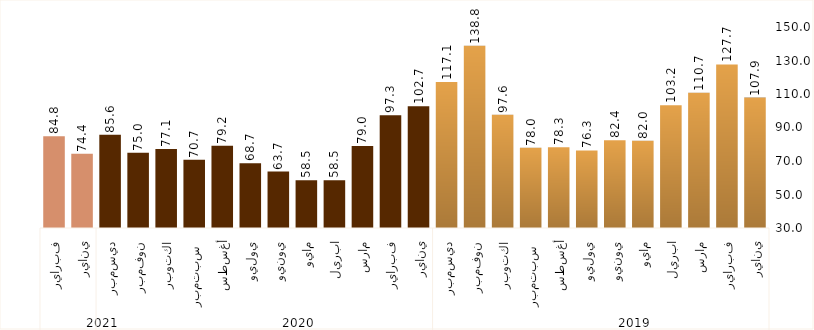
| Category | Series 0 |
|---|---|
| 0 | 107.861 |
| 1 | 127.674 |
| 2 | 110.742 |
| 3 | 103.239 |
| 4 | 82.016 |
| 5 | 82.421 |
| 6 | 76.314 |
| 7 | 78.265 |
| 8 | 77.961 |
| 9 | 97.566 |
| 10 | 138.85 |
| 11 | 117.091 |
| 12 | 102.678 |
| 13 | 97.332 |
| 14 | 78.955 |
| 15 | 58.549 |
| 16 | 58.455 |
| 17 | 63.691 |
| 18 | 68.721 |
| 19 | 79.161 |
| 20 | 70.692 |
| 21 | 77.111 |
| 22 | 74.955 |
| 23 | 85.627 |
| 24 | 74.378 |
| 25 | 84.831 |